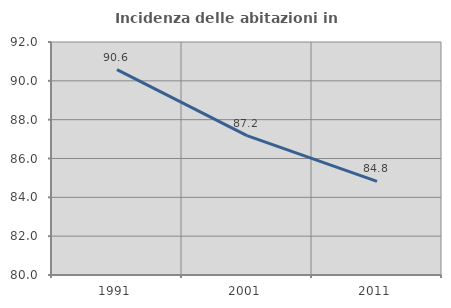
| Category | Incidenza delle abitazioni in proprietà  |
|---|---|
| 1991.0 | 90.574 |
| 2001.0 | 87.179 |
| 2011.0 | 84.818 |